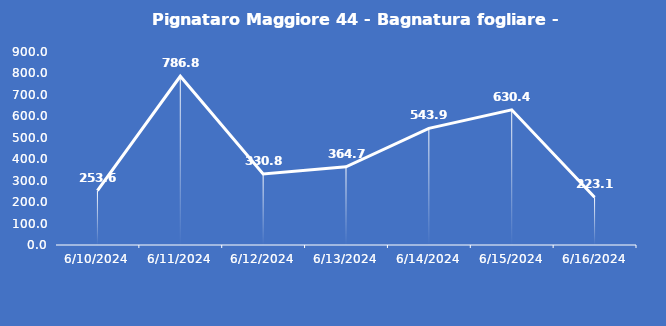
| Category | Pignataro Maggiore 44 - Bagnatura fogliare - Grezzo (min) |
|---|---|
| 6/10/24 | 253.6 |
| 6/11/24 | 786.8 |
| 6/12/24 | 330.8 |
| 6/13/24 | 364.7 |
| 6/14/24 | 543.9 |
| 6/15/24 | 630.4 |
| 6/16/24 | 223.1 |